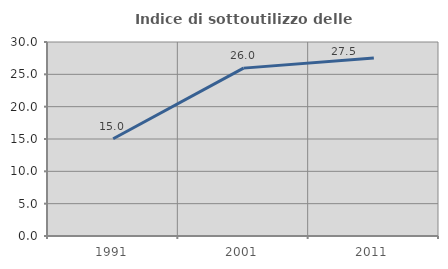
| Category | Indice di sottoutilizzo delle abitazioni  |
|---|---|
| 1991.0 | 15.046 |
| 2001.0 | 25.959 |
| 2011.0 | 27.525 |